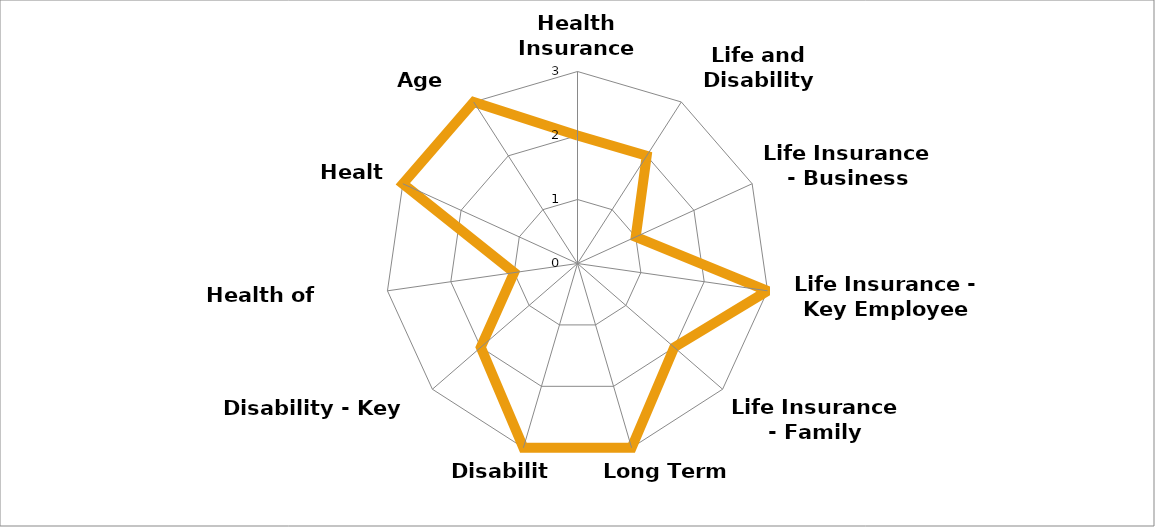
| Category | Series 0 |
|---|---|
| Health Insurance Options | 2 |
| Life and Disability Analysis | 2 |
| Life Insurance - Business | 1 |
| Life Insurance - Key Employee | 3 |
| Life Insurance - Family | 2 |
| Long Term Care | 3 |
| Disability | 3 |
| Disability - Key Man | 2 |
| Health of Employees | 1 |
| Health | 3 |
| Age Timing | 3 |